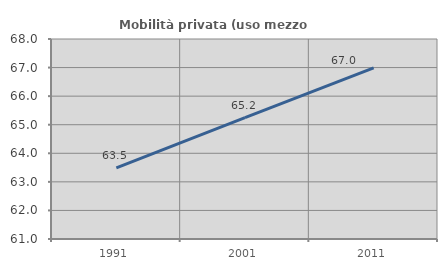
| Category | Mobilità privata (uso mezzo privato) |
|---|---|
| 1991.0 | 63.489 |
| 2001.0 | 65.245 |
| 2011.0 | 66.986 |